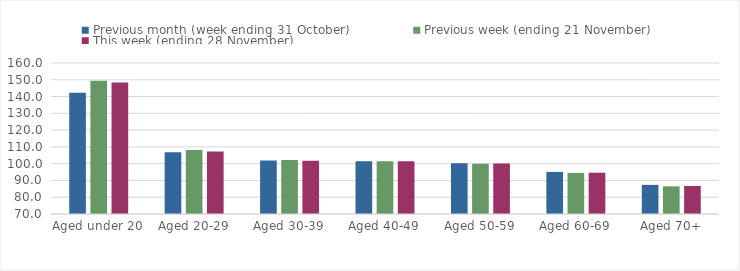
| Category | Previous month (week ending 31 October) | Previous week (ending 21 November) | This week (ending 28 November) |
|---|---|---|---|
| Aged under 20 | 142.22 | 149.42 | 148.32 |
| Aged 20-29 | 106.86 | 108.2 | 107.31 |
| Aged 30-39 | 101.86 | 102.16 | 101.7 |
| Aged 40-49 | 101.5 | 101.47 | 101.48 |
| Aged 50-59 | 100.24 | 99.97 | 100.1 |
| Aged 60-69 | 95.08 | 94.51 | 94.62 |
| Aged 70+ | 87.36 | 86.49 | 86.69 |